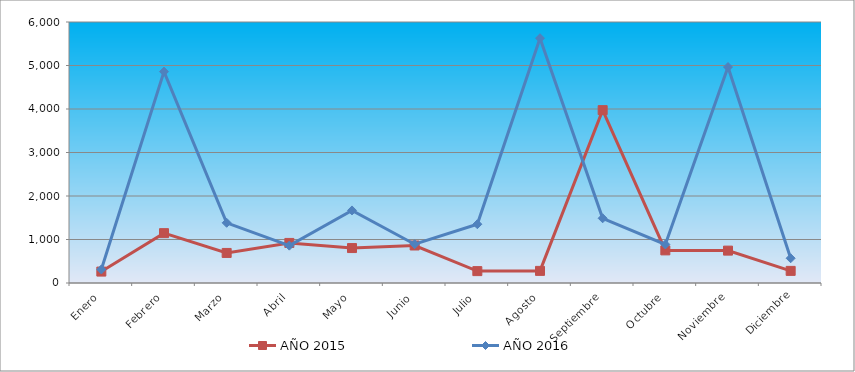
| Category | AÑO 2015 | AÑO 2016 |
|---|---|---|
| Enero | 262.401 | 311.766 |
| Febrero | 1145.998 | 4858.227 |
| Marzo | 690.812 | 1383.803 |
| Abril | 921.082 | 858.723 |
| Mayo | 803.269 | 1668.22 |
| Junio | 862.176 | 891.541 |
| Julio | 273.112 | 1350.985 |
| Agosto | 278.467 | 5626.898 |
| Septiembre | 3974.092 | 1487.724 |
| Octubre | 749.718 | 886.071 |
| Noviembre | 744.363 | 4965.185 |
| Diciembre | 278.467 | 568.836 |